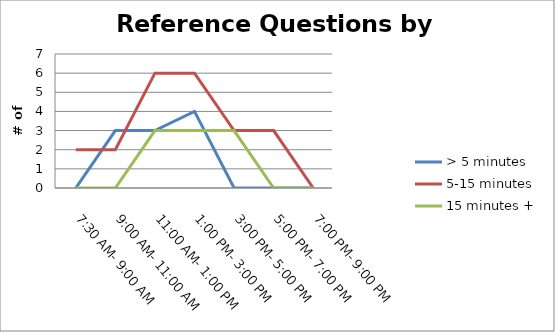
| Category | > 5 minutes | 5-15 minutes | 15 minutes + |
|---|---|---|---|
| 7:30 AM- 9:00 AM | 0 | 2 | 0 |
| 9:00 AM- 11:00 AM | 3 | 2 | 0 |
| 11:00 AM- 1:00 PM | 3 | 6 | 3 |
| 1:00 PM- 3:00 PM | 4 | 6 | 3 |
| 3:00 PM- 5:00 PM | 0 | 3 | 3 |
| 5:00 PM- 7:00 PM | 0 | 3 | 0 |
| 7:00 PM- 9:00 PM | 0 | 0 | 0 |